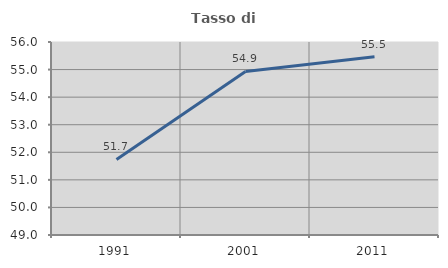
| Category | Tasso di occupazione   |
|---|---|
| 1991.0 | 51.741 |
| 2001.0 | 54.93 |
| 2011.0 | 55.468 |